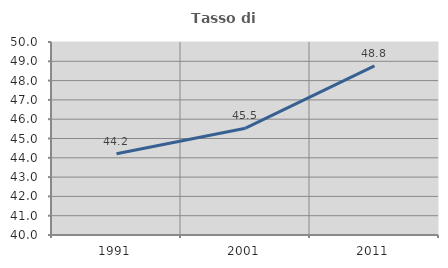
| Category | Tasso di occupazione   |
|---|---|
| 1991.0 | 44.214 |
| 2001.0 | 45.536 |
| 2011.0 | 48.759 |